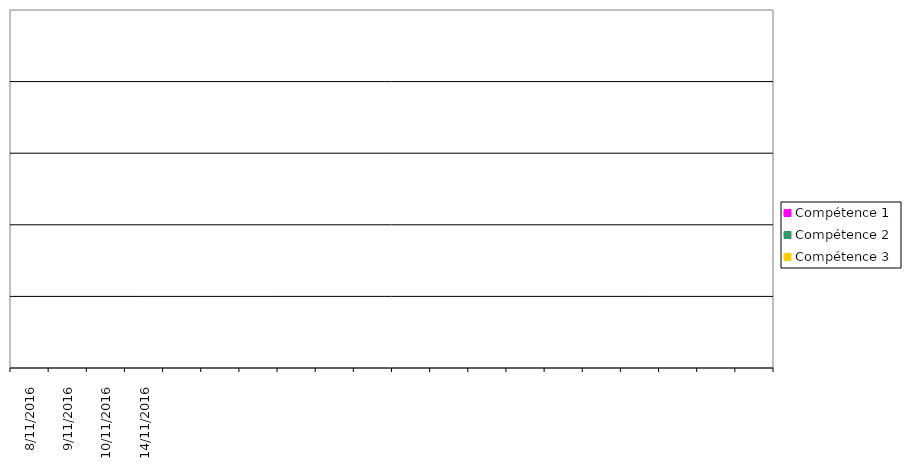
| Category | Compétence 1 | Compétence 2 | Compétence 3 |
|---|---|---|---|
| 8-11-2016 | 0 | 0 | 0 |
| 9-11-2016 | 0 | 0 | 0 |
| 10-11-2016 | 0 | 0 | 0 |
| 14-11-2016 | 0 | 0 | 0 |